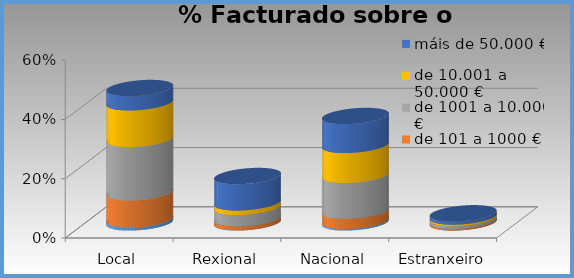
| Category | de 0 a 100 € | de 101 a 1000 € | de 1001 a 10.000 € | de 10.001 a 50.000 € | máis de 50.000 € |
|---|---|---|---|---|---|
| Local | 0.011 | 0.091 | 0.18 | 0.123 | 0.048 |
| Rexional | 0.001 | 0.013 | 0.038 | 0.016 | 0.089 |
| Nacional | 0.005 | 0.034 | 0.121 | 0.101 | 0.098 |
| Estranxeiro | 0 | 0.005 | 0.009 | 0.005 | 0.011 |